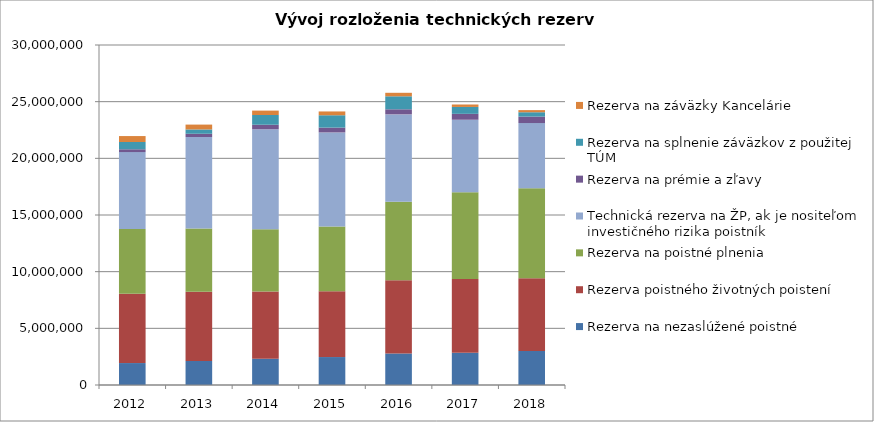
| Category | Rezerva na nezaslúžené poistné | Rezerva poistného životných poistení | Rezerva na poistné plnenia | Technická rezerva na ŽP, ak je nositeľom investičného rizika poistník | Rezerva na prémie a zľavy | Rezerva na splnenie záväzkov z použitej TÚM | Rezerva na záväzky Kancelárie |
|---|---|---|---|---|---|---|---|
| 2012.0 | 1936236 | 6114971 | 5720569 | 6782048 | 246279 | 642715 | 522246 |
| 2013.0 | 2124994 | 6109109 | 5568374 | 8079352 | 286096 | 381833 | 427392 |
| 2014.0 | 2317409 | 5928533 | 5492827 | 8828678 | 396028 | 859622 | 387682 |
| 2015.0 | 2466090 | 5811315 | 5708948 | 8297892 | 427464 | 1089541 | 335988 |
| 2016.0 | 2782031 | 6456431 | 6922565 | 7716613 | 448696 | 1146890 | 309242 |
| 2017.0 | 2843318 | 6507152 | 7652125 | 6403217 | 519982 | 608722 | 215680 |
| 2018.0 | 3008472 | 6407360 | 7941732 | 5756436 | 568988 | 383504 | 188368 |